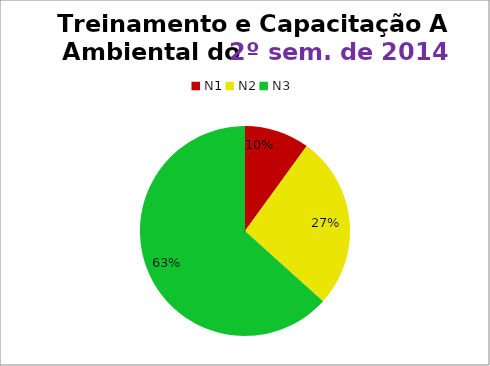
| Category | 2º/14 |
|---|---|
| N1 | 3 |
| N2 | 8 |
| N3 | 19 |